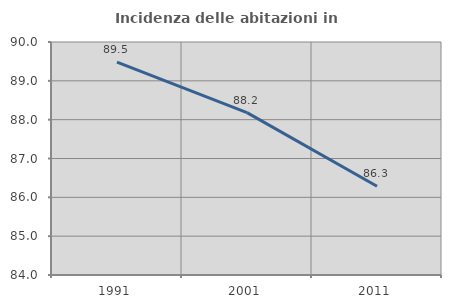
| Category | Incidenza delle abitazioni in proprietà  |
|---|---|
| 1991.0 | 89.482 |
| 2001.0 | 88.183 |
| 2011.0 | 86.286 |